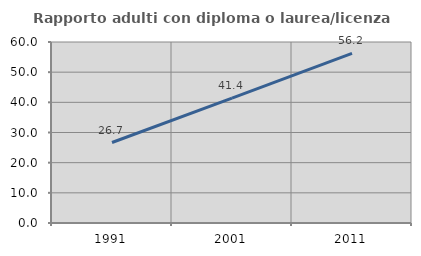
| Category | Rapporto adulti con diploma o laurea/licenza media  |
|---|---|
| 1991.0 | 26.681 |
| 2001.0 | 41.424 |
| 2011.0 | 56.209 |